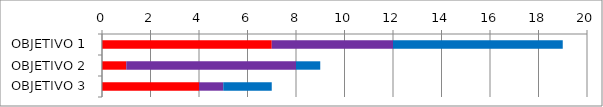
| Category | Series 0 | Series 3 | Series 1 |
|---|---|---|---|
| OBJETIVO 1 | 7 | 5 | 7 |
| OBJETIVO 2 | 1 | 7 | 1 |
| OBJETIVO 3 | 4 | 1 | 2 |